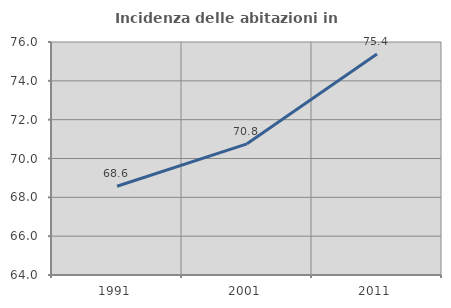
| Category | Incidenza delle abitazioni in proprietà  |
|---|---|
| 1991.0 | 68.571 |
| 2001.0 | 70.755 |
| 2011.0 | 75.385 |